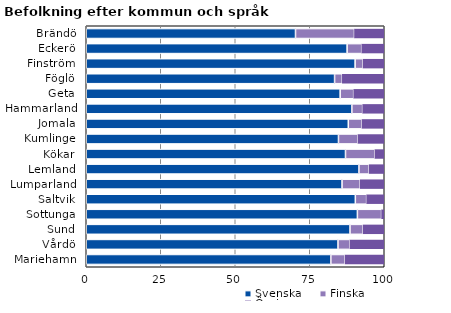
| Category | Svenska | Finska | Övriga |
|---|---|---|---|
| Brändö | 70.222 | 19.778 | 10 |
| Eckerö | 87.54 | 4.899 | 7.561 |
| Finström | 90.224 | 2.666 | 7.11 |
| Föglö | 83.333 | 2.579 | 14.087 |
| Geta | 85.207 | 4.536 | 10.256 |
| Hammarland | 89.128 | 3.624 | 7.248 |
| Jomala | 87.932 | 4.599 | 7.469 |
| Kumlinge | 84.641 | 6.536 | 8.824 |
| Kökar | 86.996 | 9.865 | 3.139 |
| Lemland | 91.506 | 3.426 | 5.068 |
| Lumparland | 85.833 | 6.111 | 8.056 |
| Saltvik | 90.296 | 3.793 | 5.912 |
| Sottunga | 90.991 | 8.108 | 0.901 |
| Sund | 88.511 | 4.396 | 7.093 |
| Vårdö | 84.479 | 3.991 | 11.53 |
| Mariehamn | 82.079 | 4.789 | 13.133 |